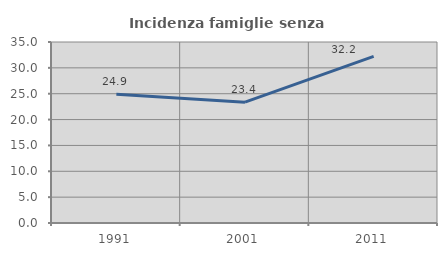
| Category | Incidenza famiglie senza nuclei |
|---|---|
| 1991.0 | 24.874 |
| 2001.0 | 23.367 |
| 2011.0 | 32.22 |